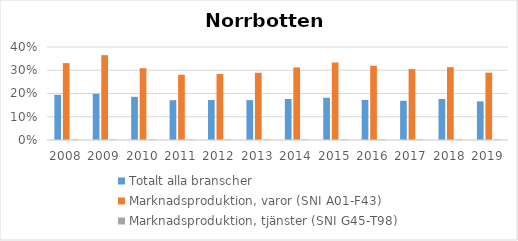
| Category | Totalt alla branscher | Marknadsproduktion, varor (SNI A01-F43) | Marknadsproduktion, tjänster (SNI G45-T98) |
|---|---|---|---|
| 2008 | 0.194 | 0.331 | 0.003 |
| 2009 | 0.199 | 0.365 | 0.003 |
| 2010 | 0.186 | 0.309 | 0.003 |
| 2011 | 0.171 | 0.281 | 0.003 |
| 2012 | 0.172 | 0.284 | 0.003 |
| 2013 | 0.172 | 0.289 | 0.002 |
| 2014 | 0.176 | 0.312 | 0.002 |
| 2015 | 0.181 | 0.333 | 0.003 |
| 2016 | 0.172 | 0.319 | 0.003 |
| 2017 | 0.169 | 0.305 | 0.003 |
| 2018 | 0.176 | 0.313 | 0.003 |
| 2019 | 0.166 | 0.29 | 0.003 |